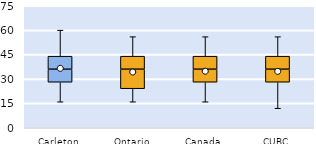
| Category | 25th | 50th | 75th |
|---|---|---|---|
| Carleton | 28 | 8 | 8 |
| Ontario | 24 | 12 | 8 |
| Canada | 28 | 8 | 8 |
| CUBC | 28 | 8 | 8 |